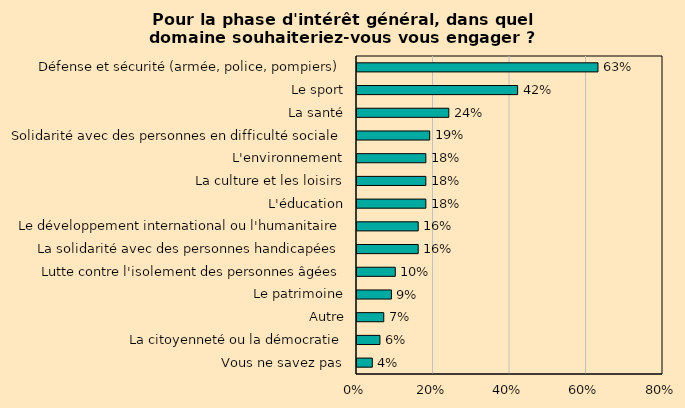
| Category | Series 0 |
|---|---|
| Défense et sécurité (armée, police, pompiers) | 0.63 |
| Le sport | 0.42 |
| La santé | 0.24 |
| Solidarité avec des personnes en difficulté sociale | 0.19 |
| L'environnement | 0.18 |
| La culture et les loisirs | 0.18 |
| L'éducation | 0.18 |
| Le développement international ou l'humanitaire | 0.16 |
| La solidarité avec des personnes handicapées | 0.16 |
| Lutte contre l'isolement des personnes âgées | 0.1 |
| Le patrimoine | 0.09 |
| Autre | 0.07 |
| La citoyenneté ou la démocratie | 0.06 |
| Vous ne savez pas | 0.04 |